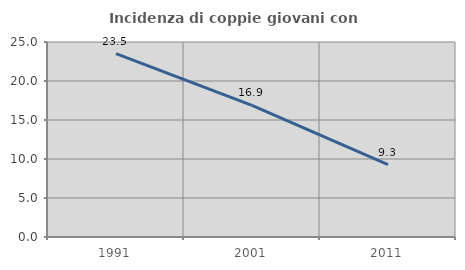
| Category | Incidenza di coppie giovani con figli |
|---|---|
| 1991.0 | 23.509 |
| 2001.0 | 16.887 |
| 2011.0 | 9.294 |